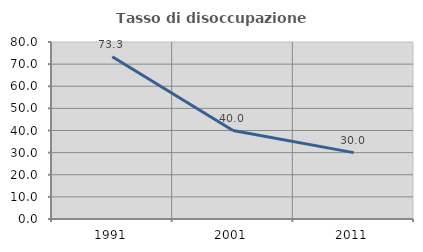
| Category | Tasso di disoccupazione giovanile  |
|---|---|
| 1991.0 | 73.333 |
| 2001.0 | 40 |
| 2011.0 | 30 |